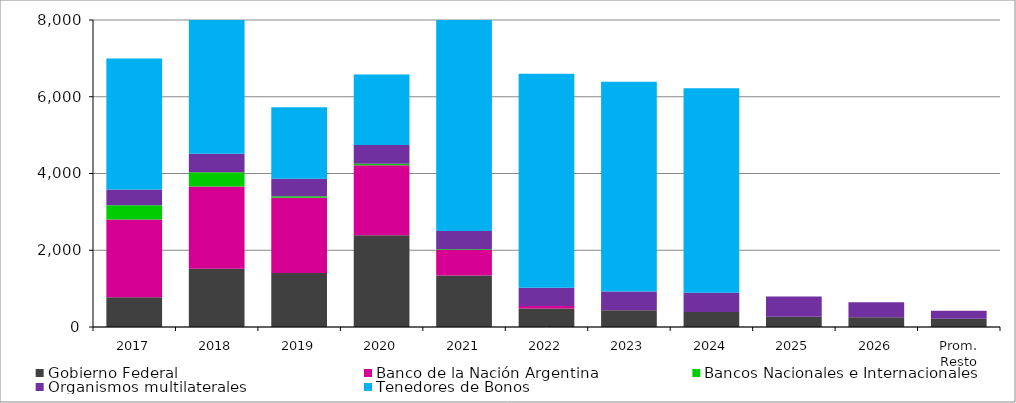
| Category | Gobierno Federal | Banco de la Nación Argentina | Bancos Nacionales e Internacionales | Organismos multilaterales | Tenedores de Bonos |
|---|---|---|---|---|---|
| 2017 | 772.306 | 2031.534 | 366.737 | 413.863 | 3412.301 |
| 2018 | 1516.973 | 2146.133 | 370.225 | 481.221 | 3977.689 |
| 2019 | 1408.353 | 1962.696 | 38.269 | 452.378 | 1867.552 |
| 2020 | 2392.57 | 1821.023 | 40.259 | 487.587 | 1836.706 |
| 2021 | 1343.533 | 664.601 | 20.571 | 472.182 | 6719.513 |
| 2022 | 482.573 | 62.427 | 0 | 480.767 | 5576.424 |
| 2023 | 436.727 | 0 | 0 | 487.664 | 5466.673 |
| 2024 | 389.857 | 0 | 0 | 502.186 | 5326.408 |
| 2025 | 268.054 | 0 | 0 | 525.378 | 0 |
| 2026 | 251.908 | 0 | 0 | 392.554 | 0 |
| Prom. Resto | 213.81 | 0 | 0 | 210.41 | 0 |